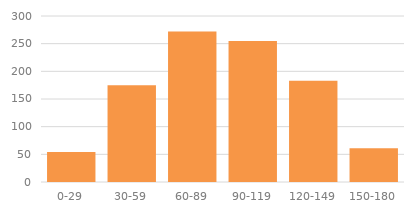
| Category | Total |
|---|---|
| 0-29 | 54 |
| 30-59 | 175 |
| 60-89 | 272 |
| 90-119 | 255 |
| 120-149 | 183 |
| 150-180 | 61 |